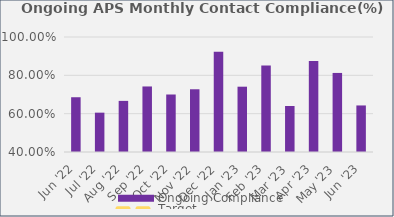
| Category | Ongoing Compliance |
|---|---|
| Jun '22 | 0.686 |
| Jul '22 | 0.605 |
| Aug '22 | 0.667 |
| Sep '22 | 0.742 |
| Oct '22 | 0.7 |
| Nov '22 | 0.727 |
| Dec '22 | 0.923 |
| Jan '23 | 0.741 |
| Feb '23 | 0.852 |
| Mar '23 | 0.64 |
| Apr '23 | 0.875 |
| May '23 | 0.812 |
| Jun '23 | 0.643 |